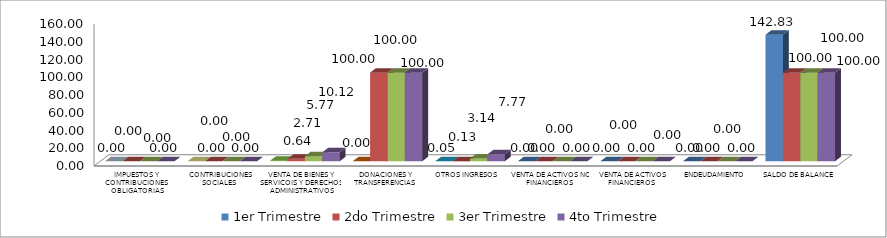
| Category | 1er Trimestre | 2do Trimestre | 3er Trimestre | 4to Trimestre |
|---|---|---|---|---|
|  IMPUESTOS Y CONTRIBUCIONES OBLIGATORIAS | 0 | 0 | 0 | 0 |
|  CONTRIBUCIONES SOCIALES | 0 | 0 | 0 | 0 |
|  VENTA DE BIENES Y SERVICOIS Y DERECHOS ADMINISTRATIVOS | 0.641 | 2.709 | 5.771 | 10.117 |
|  DONACIONES Y TRANSFERENCIAS | 0 | 100 | 100 | 100 |
|  OTROS INGRESOS | 0.048 | 0.134 | 3.143 | 7.771 |
|  VENTA DE ACTIVOS NO FINANCIEROS | 0 | 0 | 0 | 0 |
|  VENTA DE ACTIVOS FINANCIEROS | 0 | 0 | 0 | 0 |
|  ENDEUDAMIENTO | 0 | 0 | 0 | 0 |
|  SALDO DE BALANCE | 142.834 | 100 | 100 | 100 |